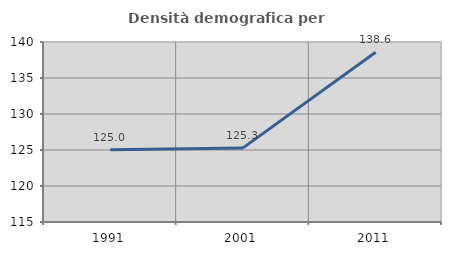
| Category | Densità demografica |
|---|---|
| 1991.0 | 125.044 |
| 2001.0 | 125.294 |
| 2011.0 | 138.573 |